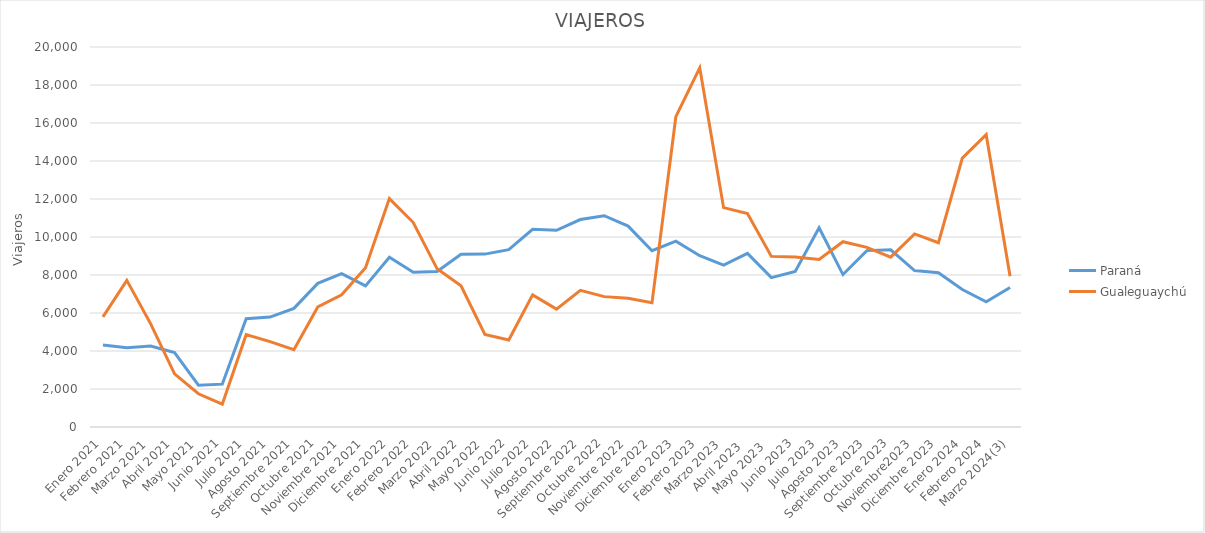
| Category | Paraná | Gualeguaychú |
|---|---|---|
| Enero 2021 | 4319 | 5798 |
| Febrero 2021 | 4167 | 7718 |
| Marzo 2021 | 4259 | 5431 |
| Abril 2021 | 3919 | 2795 |
| Mayo 2021 | 2204 | 1750 |
| Junio 2021 | 2255 | 1202 |
| Julio 2021 | 5700 | 4860 |
| Agosto 2021 | 5787 | 4494 |
| Septiembre 2021 | 6243 | 4066 |
| Octubre 2021 | 7561 | 6319 |
| Noviembre 2021 | 8074 | 6962 |
| Diciembre 2021 | 7428 | 8382 |
| Enero 2022 | 8934 | 12020 |
| Febrero 2022 | 8143 | 10760 |
| Marzo 2022 | 8189 | 8324 |
| Abril 2022 | 9096 | 7429 |
| Mayo 2022 | 9100 | 4877 |
| Junio 2022 | 9333 | 4582 |
| Julio 2022 | 10406 | 6952 |
| Agosto 2022 | 10350 | 6204 |
| Septiembre 2022 | 10919 | 7195 |
| Octubre 2022 | 11121 | 6862 |
| Noviembre 2022 | 10574 | 6772 |
| Diciembre 2022 | 9279 | 6536 |
| Enero 2023 | 9784 | 16332 |
| Febrero 2023 | 9014 | 18903 |
| Marzo 2023 | 8517 | 11545 |
| Abril 2023  | 9138 | 11237 |
| Mayo 2023  | 7860 | 8980 |
| Junio 2023 | 8185 | 8941 |
| Julio 2023 | 10484 | 8820 |
| Agosto 2023 | 8023 | 9752 |
| Septiembre 2023 | 9283 | 9452 |
| Octubre 2023 | 9329 | 8940 |
| Noviembre2023 | 8236 | 10165 |
| Diciembre 2023 | 8117 | 9696 |
| Enero 2024 | 7238 | 14152 |
| Febrero 2024 | 6584 | 15387 |
| Marzo 2024(3) | 7342 | 7938 |